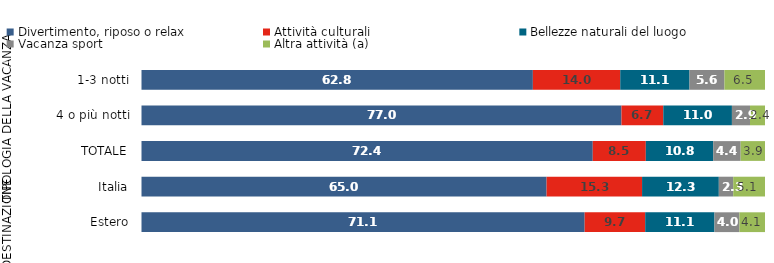
| Category | Divertimento, riposo o relax                 | Attività culturali | Bellezze naturali del luogo          | Vacanza sport                                 | Altra attività (a)        |
|---|---|---|---|---|---|
| 0 | 62.8 | 14 | 11.1 | 5.6 | 6.5 |
| 1 | 77 | 6.7 | 11 | 2.9 | 2.4 |
| 2 | 72.4 | 8.5 | 10.8 | 4.4 | 3.9 |
| 3 | 65 | 15.3 | 12.3 | 2.3 | 5.1 |
| 4 | 71.1 | 9.7 | 11.1 | 4 | 4.1 |